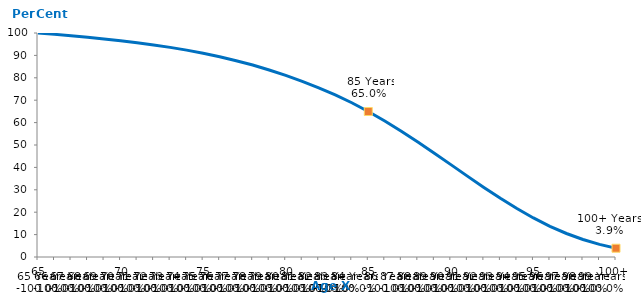
| Category | Resident Female aged 65 years in 2022 |
|---|---|
|  65 | 100 |
|  66 | 99.414 |
|  67 | 98.778 |
|  68 | 98.088 |
|  69 | 97.331 |
|  70 | 96.506 |
|  71 | 95.616 |
|  72 | 94.65 |
|  73 | 93.577 |
|  74 | 92.353 |
|  75 | 90.955 |
|  76 | 89.384 |
|  77 | 87.638 |
|  78 | 85.691 |
|  79 | 83.501 |
|  80 | 81.059 |
|  81 | 78.39 |
|  82 | 75.5 |
|  83 | 72.352 |
|  84 | 68.857 |
|  85 | 64.961 |
|  86 | 60.724 |
|  87 | 56.177 |
|  88 | 51.368 |
|  89 | 46.362 |
|  90 | 41.242 |
|  91 | 36.102 |
|  92 | 31.047 |
|  93 | 26.184 |
|  94 | 21.617 |
|  95 | 17.437 |
|  96 | 13.715 |
|  97 | 10.498 |
|  98 | 7.803 |
|  99 | 5.621 |
| 100+ | 3.916 |